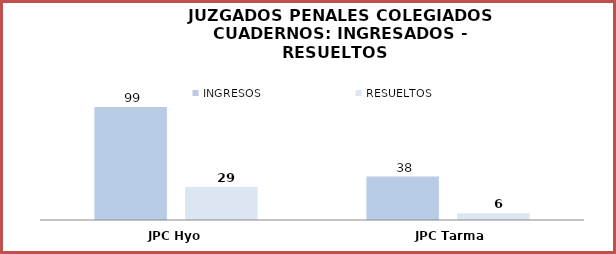
| Category | INGRESOS | RESUELTOS |
|---|---|---|
| JPC Hyo | 99 | 29 |
| JPC Tarma | 38 | 6 |